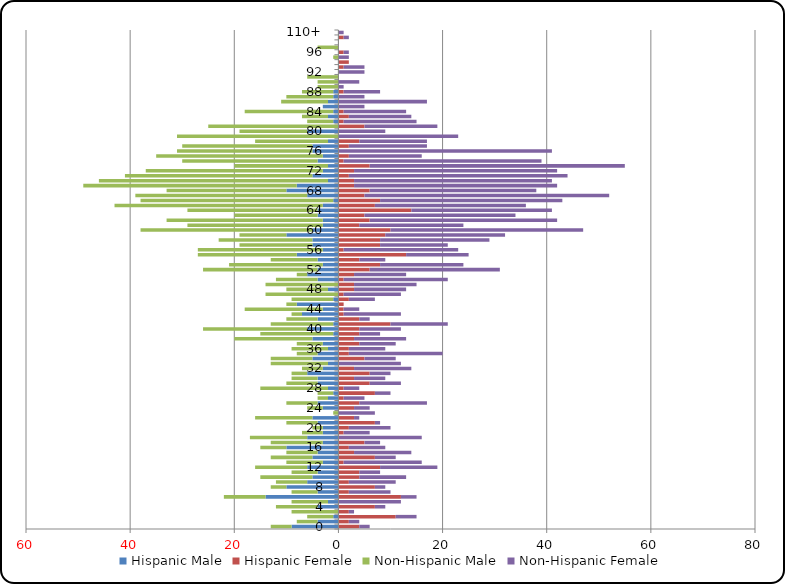
| Category | Hispanic Male | Hispanic Female | Non-Hispanic Male | Non-Hispanic Female |
|---|---|---|---|---|
| 0 | -9 | 4 | -4 | 2 |
| 1 | -4 | 2 | -4 | 2 |
| 2 | -1 | 11 | -5 | 4 |
| 3 | 0 | 2 | -9 | 1 |
| 4 | -4 | 7 | -8 | 2 |
| 5 | -2 | 0 | -7 | 12 |
| 6 | -14 | 12 | -8 | 3 |
| 7 | -4 | 2 | -5 | 8 |
| 8 | -10 | 7 | -3 | 2 |
| 9 | -6 | 2 | -6 | 9 |
| 10 | -5 | 4 | -10 | 9 |
| 11 | -4 | 4 | -5 | 4 |
| 12 | -6 | 8 | -10 | 11 |
| 13 | -3 | 1 | -7 | 15 |
| 14 | -5 | 7 | -8 | 4 |
| 15 | -4 | 3 | -6 | 11 |
| 16 | -10 | 2 | -5 | 7 |
| 17 | -3 | 5 | -10 | 3 |
| 18 | -6 | 0 | -11 | 16 |
| 19 | -3 | 1 | -4 | 5 |
| 20 | -3 | 2 | -2 | 8 |
| 21 | -4 | 7 | -6 | 1 |
| 22 | -5 | 3 | -11 | 1 |
| 23 | 0 | 0 | -1 | 7 |
| 24 | -3 | 3 | -3 | 3 |
| 25 | -4 | 4 | -6 | 13 |
| 26 | -2 | 1 | -2 | 4 |
| 27 | -1 | 7 | -3 | 3 |
| 28 | -2 | 1 | -13 | 3 |
| 29 | -4 | 6 | -6 | 6 |
| 30 | -4 | 3 | -5 | 6 |
| 31 | -6 | 6 | -3 | 4 |
| 32 | -3 | 3 | -4 | 11 |
| 33 | -2 | 0 | -11 | 12 |
| 34 | -5 | 5 | -8 | 6 |
| 35 | -4 | 2 | -4 | 18 |
| 36 | -2 | 2 | -7 | 7 |
| 37 | -3 | 4 | -5 | 7 |
| 38 | -5 | 3 | -15 | 10 |
| 39 | -1 | 4 | -14 | 4 |
| 40 | -6 | 4 | -20 | 8 |
| 41 | -1 | 10 | -12 | 11 |
| 42 | -4 | 4 | -6 | 2 |
| 43 | -7 | 1 | -2 | 11 |
| 44 | -3 | 1 | -15 | 3 |
| 45 | -8 | 1 | -2 | 0 |
| 46 | -1 | 2 | -8 | 5 |
| 47 | 0 | 1 | -14 | 11 |
| 48 | -2 | 3 | -8 | 10 |
| 49 | 0 | 3 | -14 | 12 |
| 50 | -4 | 1 | -8 | 20 |
| 51 | -6 | 3 | -2 | 10 |
| 52 | -4 | 6 | -22 | 25 |
| 53 | -3 | 8 | -18 | 16 |
| 54 | -4 | 4 | -9 | 5 |
| 55 | -8 | 13 | -19 | 12 |
| 56 | -3 | 1 | -24 | 22 |
| 57 | -5 | 8 | -14 | 13 |
| 58 | -5 | 8 | -18 | 21 |
| 59 | -10 | 9 | -9 | 23 |
| 60 | -5 | 10 | -33 | 37 |
| 61 | -3 | 4 | -26 | 20 |
| 62 | -3 | 6 | -30 | 36 |
| 63 | -4 | 5 | -16 | 29 |
| 64 | -4 | 14 | -25 | 27 |
| 65 | -3 | 7 | -40 | 29 |
| 66 | -1 | 8 | -37 | 35 |
| 67 | -6 | 5 | -33 | 47 |
| 68 | -10 | 6 | -23 | 32 |
| 69 | -8 | 3 | -41 | 39 |
| 70 | -2 | 3 | -44 | 38 |
| 71 | -5 | 2 | -36 | 42 |
| 72 | -3 | 3 | -34 | 39 |
| 73 | -2 | 6 | -18 | 49 |
| 74 | -4 | 1 | -26 | 38 |
| 75 | -3 | 2 | -32 | 14 |
| 76 | -5 | 0 | -26 | 41 |
| 77 | -5 | 2 | -25 | 15 |
| 78 | -2 | 4 | -14 | 13 |
| 79 | 0 | 0 | -31 | 23 |
| 80 | -6 | 0 | -13 | 9 |
| 81 | 0 | 5 | -25 | 14 |
| 82 | -1 | 1 | -5 | 14 |
| 83 | -2 | 2 | -5 | 12 |
| 84 | -1 | 1 | -17 | 12 |
| 85 | -3 | 0 | 0 | 5 |
| 86 | -2 | 0 | -9 | 17 |
| 87 | -1 | 0 | -9 | 5 |
| 88 | -1 | 1 | -6 | 7 |
| 89 | 0 | 0 | -4 | 1 |
| 90 | 0 | 0 | -4 | 4 |
| 91 | 0 | 0 | -6 | 0 |
| 92 | 0 | 0 | 0 | 5 |
| 93 | 0 | 1 | 0 | 4 |
| 94 | 0 | 2 | 0 | 0 |
| 95 | 0 | 0 | -1 | 2 |
| 96 | 0 | 1 | 0 | 1 |
| 97 | 0 | 0 | -4 | 0 |
| 98 | 0 | 0 | 0 | 0 |
| 99 | 0 | 1 | 0 | 1 |
| 110+ | 0 | 0 | 0 | 1 |